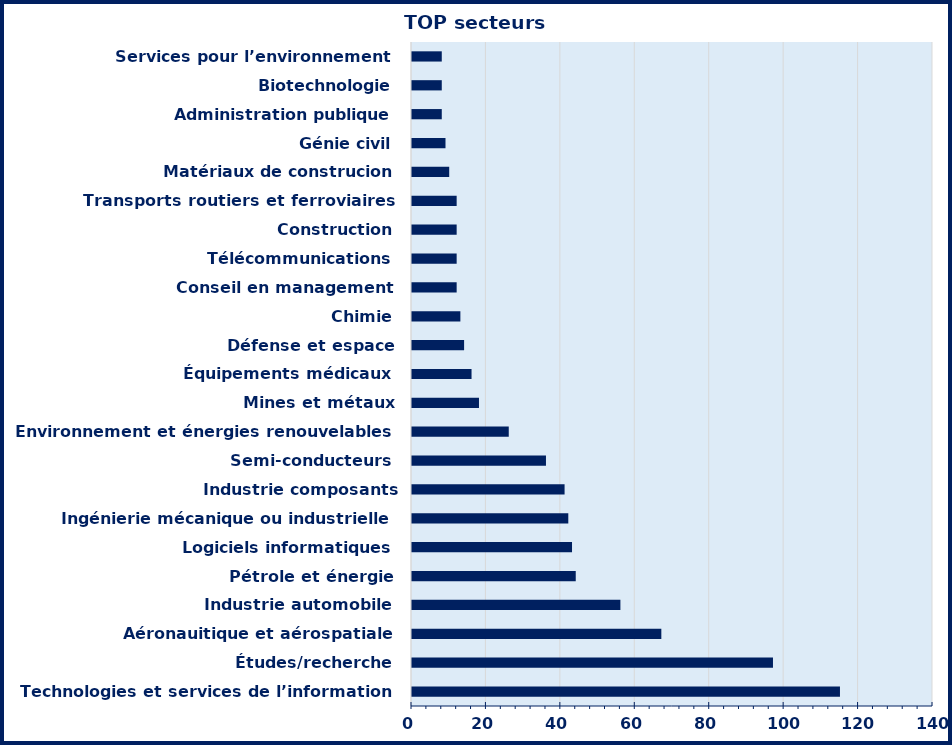
| Category | Series 0 |
|---|---|
| Technologies et services de l’information | 115 |
| Études/recherche | 97 |
| Aéronauitique et aérospatiale | 67 |
| Industrie automobile | 56 |
| Pétrole et énergie | 44 |
| Logiciels informatiques | 43 |
| Ingénierie mécanique ou industrielle | 42 |
| Industrie composants électriques/électroniques | 41 |
| Semi-conducteurs | 36 |
| Environnement et énergies renouvelables | 26 |
| Mines et métaux | 18 |
| Équipements médicaux | 16 |
| Défense et espace | 14 |
| Chimie | 13 |
| Conseil en management | 12 |
| Télécommunications | 12 |
| Construction | 12 |
| Transports routiers et ferroviaires | 12 |
| Matériaux de construcion | 10 |
| Génie civil | 9 |
| Administration publique | 8 |
| Biotechnologie | 8 |
| Services pour l’environnement | 8 |